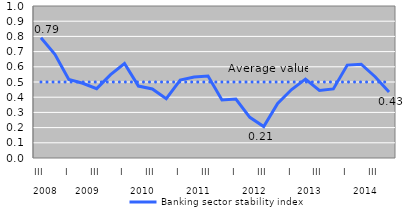
| Category | Banking sector stability index | Average value |
|---|---|---|
| 0 | 0.792 | 0.5 |
| 1 | 0.682 | 0.5 |
| 2 | 0.517 | 0.5 |
| 3 | 0.492 | 0.5 |
| 4 | 0.456 | 0.5 |
| 5 | 0.548 | 0.5 |
| 6 | 0.622 | 0.5 |
| 7 | 0.473 | 0.5 |
| 8 | 0.454 | 0.5 |
| 9 | 0.391 | 0.5 |
| 10 | 0.513 | 0.5 |
| 11 | 0.533 | 0.5 |
| 12 | 0.539 | 0.5 |
| 13 | 0.382 | 0.5 |
| 14 | 0.388 | 0.5 |
| 15 | 0.267 | 0.5 |
| 16 | 0.207 | 0.5 |
| 17 | 0.359 | 0.5 |
| 18 | 0.45 | 0.5 |
| 19 | 0.519 | 0.5 |
| 20 | 0.444 | 0.5 |
| 21 | 0.454 | 0.5 |
| 22 | 0.611 | 0.5 |
| 23 | 0.617 | 0.5 |
| 24 | 0.535 | 0.5 |
| 25 | 0.435 | 0.5 |